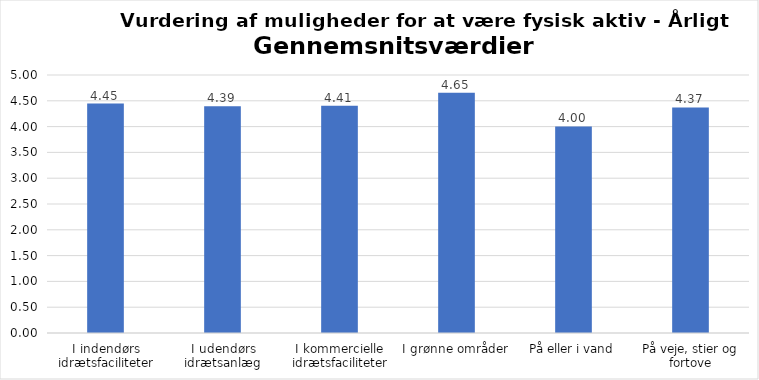
| Category | Gennemsnit |
|---|---|
| I indendørs idrætsfaciliteter | 4.445 |
| I udendørs idrætsanlæg | 4.393 |
| I kommercielle idrætsfaciliteter | 4.405 |
| I grønne områder | 4.654 |
| På eller i vand | 4.003 |
| På veje, stier og fortove | 4.372 |